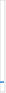
| Category | Caso | Resuelta | Pendiente |
|---|---|---|---|
| Quejas | 1 | 1 | 0 |
| Reclamaciones  | 1 | 1 | 0 |
| Sugerencias | 0 | 0 | 0 |
| Otras | 0 | 0 | 0 |
| Total | 1 | 1 | 0 |